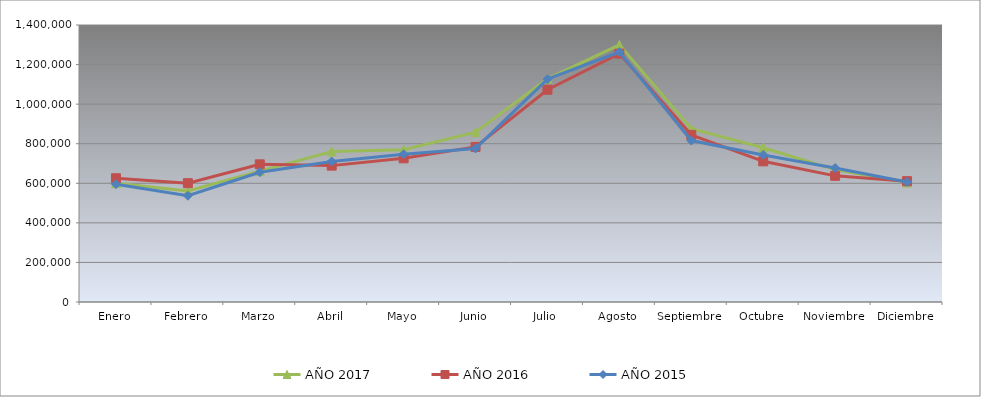
| Category | AÑO 2017 | AÑO 2016 | AÑO 2015 |
|---|---|---|---|
| Enero | 600580 | 625460 | 595440 |
| Febrero | 561080 | 600500 | 537220 |
| Marzo | 661580 | 695860 | 656000 |
| Abril | 761000 | 689280 | 710200 |
| Mayo | 770040 | 726220 | 746780 |
| Junio | 858300 | 783840 | 776040 |
| Julio | 1128220 | 1072840 | 1126280 |
| Agosto | 1299460 | 1255440 | 1263120 |
| Septiembre | 875520 | 844710 | 816000 |
| Octubre | 779860 | 710980 | 743420 |
| Noviembre | 669100 | 637560 | 677380 |
| Diciembre | 604220 | 610780 | 606460 |